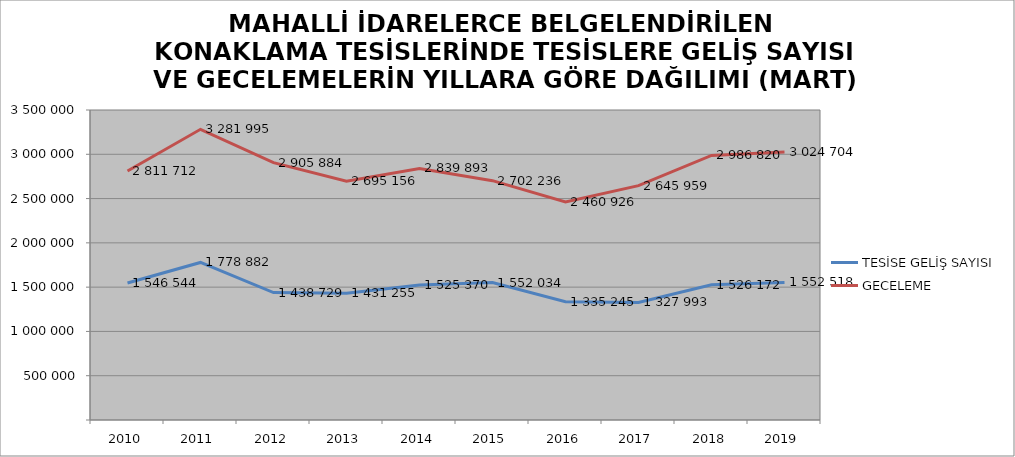
| Category | TESİSE GELİŞ SAYISI | GECELEME |
|---|---|---|
| 2010 | 1546544 | 2811712 |
| 2011 | 1778882 | 3281995 |
| 2012 | 1438729 | 2905884 |
| 2013 | 1431255 | 2695156 |
| 2014 | 1525370 | 2839893 |
| 2015 | 1552034 | 2702236 |
| 2016 | 1335245 | 2460926 |
| 2017 | 1327993 | 2645959 |
| 2018 | 1526172 | 2986820 |
| 2019 | 1552518 | 3024704 |